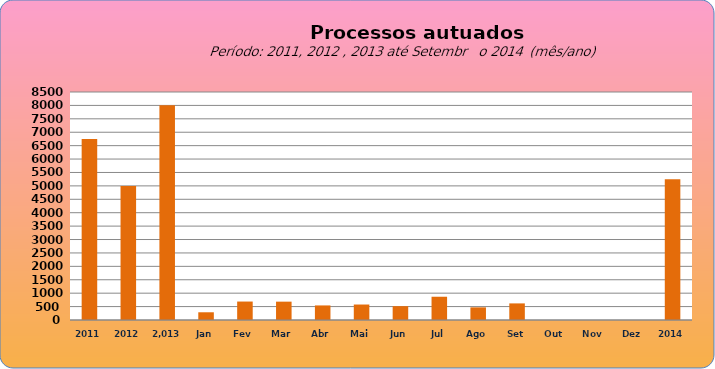
| Category | 6749 4998  8.003   288  688 684 543 577 516 867 471 619 0 0 0 |
|---|---|
| 2011 | 6749 |
| 2012 | 4998 |
|  2.013  | 8003 |
| Jan | 288 |
| Fev | 688 |
| Mar | 684 |
| Abr | 543 |
| Mai | 577 |
| Jun | 516 |
| Jul | 867 |
| Ago | 471 |
| Set | 619 |
| Out | 0 |
| Nov | 0 |
| Dez | 0 |
| 2014 | 5244 |